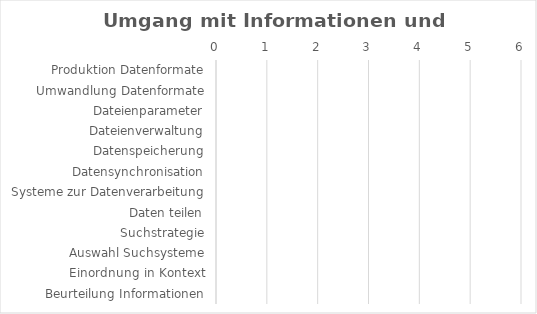
| Category | Umgang mit Informationen und Daten
 |
|---|---|
| Produktion Datenformate | 0 |
| Umwandlung Datenformate | 0 |
| Dateienparameter | 0 |
| Dateienverwaltung | 0 |
| Datenspeicherung | 0 |
| Datensynchronisation | 0 |
| Systeme zur Datenverarbeitung | 0 |
| Daten teilen | 0 |
| Suchstrategie | 0 |
| Auswahl Suchsysteme | 0 |
| Einordnung in Kontext | 0 |
| Beurteilung Informationen | 0 |